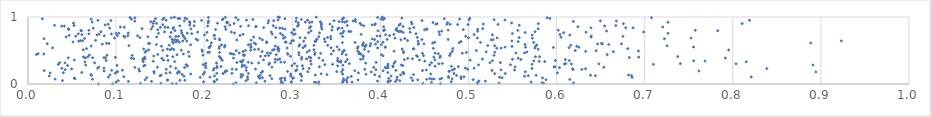
| Category | Series 0 |
|---|---|
| 0.2328687505354845 | 0.001 |
| 0.07985631081424627 | 0.002 |
| 0.32970792937901716 | 0.003 |
| 0.09586170251960835 | 0.004 |
| 0.468317660691981 | 0.005 |
| 0.16840218601111323 | 0.006 |
| 0.16377316991477586 | 0.007 |
| 0.44841327587638014 | 0.008 |
| 0.12768319481553603 | 0.009 |
| 0.5101289718172626 | 0.01 |
| 0.5851955264971506 | 0.011 |
| 0.15096220773053282 | 0.012 |
| 0.28772167522168735 | 0.013 |
| 0.5345921869728488 | 0.014 |
| 0.6191756038142968 | 0.015 |
| 0.28903604583037135 | 0.016 |
| 0.25926370127524345 | 0.017 |
| 0.583497027038752 | 0.018 |
| 0.23612617243051293 | 0.019 |
| 0.5104325848255693 | 0.02 |
| 0.45796966681437346 | 0.021 |
| 0.32661529935529565 | 0.022 |
| 0.3569881664401344 | 0.023 |
| 0.32506366698966016 | 0.024 |
| 0.4087326561707222 | 0.025 |
| 0.29890451249362826 | 0.026 |
| 0.0999517640275771 | 0.027 |
| 0.3620035093107602 | 0.028 |
| 0.5711118244665004 | 0.029 |
| 0.3678636016856771 | 0.03 |
| 0.33016795018199285 | 0.031 |
| 0.1993451033296899 | 0.032 |
| 0.29874945473208747 | 0.033 |
| 0.48039946728180183 | 0.034 |
| 0.21180971960481088 | 0.035 |
| 0.21098794096834272 | 0.036 |
| 0.4171767720957875 | 0.037 |
| 0.11392857607429108 | 0.038 |
| 0.14019868509256161 | 0.039 |
| 0.2874289543334464 | 0.04 |
| 0.4089311232788855 | 0.041 |
| 0.26893037244798557 | 0.042 |
| 0.5191626881948773 | 0.043 |
| 0.3966805963971781 | 0.044 |
| 0.3575202795973894 | 0.045 |
| 0.5117984216452389 | 0.046 |
| 0.24737268440043192 | 0.047 |
| 0.4113730152044808 | 0.048 |
| 0.42203946458177044 | 0.049 |
| 0.10242254594053013 | 0.05 |
| 0.03911909487975007 | 0.051 |
| 0.4366187233679497 | 0.052 |
| 0.31019966936869225 | 0.053 |
| 0.3582213677625674 | 0.054 |
| 0.17235700457381598 | 0.055 |
| 0.17809717594927243 | 0.056 |
| 0.29170650323487546 | 0.057 |
| 0.15858816228656591 | 0.058 |
| 0.15816459434712005 | 0.059 |
| 0.3614363946928071 | 0.06 |
| 0.3745648386261391 | 0.061 |
| 0.44241928218221815 | 0.062 |
| 0.13293241169433367 | 0.063 |
| 0.5878964906693323 | 0.064 |
| 0.5053427729518827 | 0.065 |
| 0.21448796717333118 | 0.066 |
| 0.4187717475298791 | 0.067 |
| 0.6149547701402488 | 0.068 |
| 0.4525678347234705 | 0.069 |
| 0.24937516918839986 | 0.07 |
| 0.07319056521161227 | 0.071 |
| 0.458594147436883 | 0.072 |
| 0.0307659920790454 | 0.073 |
| 0.4676146336173843 | 0.074 |
| 0.4609212214147962 | 0.075 |
| 0.48139518945270043 | 0.076 |
| 0.28627201561672666 | 0.077 |
| 0.05331611529346647 | 0.078 |
| 0.3581332978127547 | 0.079 |
| 0.2767040038696874 | 0.08 |
| 0.4916735848345679 | 0.081 |
| 0.45604758193484707 | 0.082 |
| 0.40934783081463133 | 0.083 |
| 0.4695348456406977 | 0.084 |
| 0.2878412093043303 | 0.085 |
| 0.26302418100290703 | 0.086 |
| 0.300279531940986 | 0.087 |
| 0.05244781303607693 | 0.088 |
| 0.3013600324232738 | 0.089 |
| 0.29146711114821133 | 0.09 |
| 0.4349559166169362 | 0.091 |
| 0.5840233962609025 | 0.092 |
| 0.5380355820448371 | 0.093 |
| 0.2660654545261235 | 0.094 |
| 0.13480485293380473 | 0.095 |
| 0.3629970421834168 | 0.096 |
| 0.6856957919775051 | 0.097 |
| 0.4772890403069291 | 0.098 |
| 0.19551447348626427 | 0.099 |
| 0.5353494066396696 | 0.1 |
| 0.24193530837986055 | 0.101 |
| 0.09128586747796508 | 0.102 |
| 0.20645783469628998 | 0.103 |
| 0.41893606247042336 | 0.104 |
| 0.8209304908400216 | 0.105 |
| 0.2491481330173907 | 0.106 |
| 0.49492015454373905 | 0.107 |
| 0.49148069610068434 | 0.108 |
| 0.10860939980728723 | 0.109 |
| 0.24218563662986314 | 0.11 |
| 0.4772841884413239 | 0.111 |
| 0.26144929191852617 | 0.112 |
| 0.3987702632458656 | 0.113 |
| 0.36689843125906374 | 0.114 |
| 0.5636171093701212 | 0.115 |
| 0.3106588605299738 | 0.116 |
| 0.1770847698549204 | 0.117 |
| 0.2981478704582018 | 0.118 |
| 0.024150729611461252 | 0.119 |
| 0.41212419324857896 | 0.12 |
| 0.21166065104273768 | 0.121 |
| 0.14974056795918034 | 0.122 |
| 0.5678627244585472 | 0.123 |
| 0.6440480887198466 | 0.124 |
| 0.27472221087042126 | 0.125 |
| 0.684959660125566 | 0.126 |
| 0.4864065783149276 | 0.127 |
| 0.2634008439309212 | 0.128 |
| 0.0718967995497799 | 0.129 |
| 0.5767779869952437 | 0.13 |
| 0.6385446493662993 | 0.131 |
| 0.15120932257867947 | 0.132 |
| 0.6815573095618966 | 0.133 |
| 0.32609280352704073 | 0.134 |
| 0.4229501292705765 | 0.135 |
| 0.09306859038011994 | 0.136 |
| 0.243905293665572 | 0.137 |
| 0.39356451659883596 | 0.138 |
| 0.3393518279098924 | 0.139 |
| 0.43754894708359426 | 0.14 |
| 0.07138485575765263 | 0.141 |
| 0.24210626047522532 | 0.142 |
| 0.30901662348794845 | 0.143 |
| 0.17487638439330488 | 0.144 |
| 0.198842802520676 | 0.145 |
| 0.383671814693307 | 0.146 |
| 0.35721873548367944 | 0.147 |
| 0.18472549303354702 | 0.148 |
| 0.29814473843474876 | 0.149 |
| 0.45724470795385963 | 0.15 |
| 0.30948837161336396 | 0.151 |
| 0.3327470623248263 | 0.152 |
| 0.4264730480728496 | 0.153 |
| 0.5296685749882916 | 0.154 |
| 0.22129531614713416 | 0.155 |
| 0.5416364656752849 | 0.156 |
| 0.48344974856481526 | 0.157 |
| 0.25009711345329333 | 0.158 |
| 0.21424059010582408 | 0.159 |
| 0.23143627569005054 | 0.16 |
| 0.1694611853810999 | 0.161 |
| 0.09888319057937123 | 0.162 |
| 0.15671518558429764 | 0.163 |
| 0.14311296365710147 | 0.164 |
| 0.025120592958008947 | 0.165 |
| 0.6008926748481448 | 0.166 |
| 0.37507282681856924 | 0.167 |
| 0.2648081104778591 | 0.168 |
| 0.04012231677047662 | 0.169 |
| 0.16107133733087675 | 0.17 |
| 0.40842148806568146 | 0.171 |
| 0.06103960891388671 | 0.172 |
| 0.4256873946628732 | 0.173 |
| 0.20038088850511737 | 0.174 |
| 0.42578098037090817 | 0.175 |
| 0.17196198564926146 | 0.176 |
| 0.22350257829591913 | 0.177 |
| 0.10073414729269992 | 0.178 |
| 0.8943069853897898 | 0.179 |
| 0.38956207757628114 | 0.18 |
| 0.3559401647155821 | 0.181 |
| 0.5644064006440236 | 0.182 |
| 0.3175662662653379 | 0.183 |
| 0.10172317379097051 | 0.184 |
| 0.35042003271572086 | 0.185 |
| 0.14299681292843347 | 0.186 |
| 0.2946496954638854 | 0.187 |
| 0.26632624460783694 | 0.188 |
| 0.17070290930114507 | 0.189 |
| 0.4777139435478369 | 0.19 |
| 0.4783994799006209 | 0.191 |
| 0.22398273817426495 | 0.192 |
| 0.12664823392915525 | 0.193 |
| 0.0863139867749192 | 0.194 |
| 0.7614707076780228 | 0.195 |
| 0.2255996856112812 | 0.196 |
| 0.3037541609415234 | 0.197 |
| 0.40305924648486113 | 0.198 |
| 0.3709177903242866 | 0.199 |
| 0.01841185776337817 | 0.2 |
| 0.44778681369250084 | 0.201 |
| 0.5265301150501831 | 0.202 |
| 0.24774072713833573 | 0.203 |
| 0.4176206209943413 | 0.204 |
| 0.09502699033719308 | 0.205 |
| 0.10715025703546321 | 0.206 |
| 0.21033277072568435 | 0.207 |
| 0.5522770664286352 | 0.208 |
| 0.4817292498183987 | 0.209 |
| 0.4521044349714677 | 0.21 |
| 0.5368813309387351 | 0.211 |
| 0.3053146128705728 | 0.212 |
| 0.39499648759052697 | 0.213 |
| 0.04220802862150863 | 0.214 |
| 0.6186581424963673 | 0.215 |
| 0.35738085853121215 | 0.216 |
| 0.23632425237678 | 0.217 |
| 0.6286648173595683 | 0.218 |
| 0.3823027056801488 | 0.219 |
| 0.1569500295169769 | 0.22 |
| 0.4988740404298041 | 0.221 |
| 0.2316721457045835 | 0.222 |
| 0.1257837520191003 | 0.223 |
| 0.04949625400770519 | 0.224 |
| 0.25820148214637306 | 0.225 |
| 0.48405676518307583 | 0.226 |
| 0.6182791124080771 | 0.227 |
| 0.6328302813062713 | 0.228 |
| 0.31230264443818856 | 0.229 |
| 0.8385374567968015 | 0.23 |
| 0.5720448528303362 | 0.231 |
| 0.21120558554560642 | 0.232 |
| 0.3190894370409938 | 0.233 |
| 0.03839661001681549 | 0.234 |
| 0.16774482123650103 | 0.235 |
| 0.07896081902508312 | 0.236 |
| 0.5063460903356365 | 0.237 |
| 0.08621745128475156 | 0.238 |
| 0.49636356584575037 | 0.239 |
| 0.40701854491453193 | 0.24 |
| 0.2019129035963283 | 0.241 |
| 0.4087574256944718 | 0.242 |
| 0.2143647086794327 | 0.243 |
| 0.17773127963488078 | 0.244 |
| 0.6033551965119244 | 0.245 |
| 0.4053160628417304 | 0.246 |
| 0.2478003390432315 | 0.247 |
| 0.12123343190717539 | 0.248 |
| 0.3924768235207914 | 0.249 |
| 0.6535389961754724 | 0.25 |
| 0.14691086571393241 | 0.251 |
| 0.276831329284828 | 0.252 |
| 0.08049048390907887 | 0.253 |
| 0.5970693848132125 | 0.254 |
| 0.5529061691099615 | 0.255 |
| 0.41429525402876277 | 0.256 |
| 0.3306788769487885 | 0.257 |
| 0.5982138059570751 | 0.258 |
| 0.4884262082714512 | 0.259 |
| 0.2191770282978195 | 0.26 |
| 0.24302291050637637 | 0.261 |
| 0.16177201513523043 | 0.262 |
| 0.48060230975238605 | 0.263 |
| 0.21461223447545008 | 0.264 |
| 0.4619929761594165 | 0.265 |
| 0.3055107124889106 | 0.266 |
| 0.1313550164100672 | 0.267 |
| 0.18096591132298212 | 0.268 |
| 0.4142182698608473 | 0.269 |
| 0.40854619802082226 | 0.27 |
| 0.3515308216746168 | 0.271 |
| 0.20158342161109177 | 0.272 |
| 0.3114559975238298 | 0.273 |
| 0.29961213386422747 | 0.274 |
| 0.42533375279879715 | 0.275 |
| 0.04496393452271519 | 0.276 |
| 0.24565868135688218 | 0.277 |
| 0.10113879592445729 | 0.278 |
| 0.13277377377719812 | 0.279 |
| 0.357355536694567 | 0.28 |
| 0.24333229863103412 | 0.281 |
| 0.06540808310089241 | 0.282 |
| 0.8910408556456453 | 0.283 |
| 0.4558425768731821 | 0.284 |
| 0.4238301634432555 | 0.285 |
| 0.5112785337230603 | 0.286 |
| 0.547698810485189 | 0.287 |
| 0.17948643447374857 | 0.288 |
| 0.1988192341601751 | 0.289 |
| 0.336977125428229 | 0.29 |
| 0.2734619893491457 | 0.291 |
| 0.03438634216246783 | 0.292 |
| 0.7098118697170744 | 0.293 |
| 0.3456767614437163 | 0.294 |
| 0.5721566392409666 | 0.295 |
| 0.3213937926912358 | 0.296 |
| 0.40859392018901275 | 0.297 |
| 0.6088341586629942 | 0.298 |
| 0.6168350638964422 | 0.299 |
| 0.6480261242633237 | 0.3 |
| 0.8036658700635181 | 0.301 |
| 0.4662555592006584 | 0.302 |
| 0.7404417649579672 | 0.303 |
| 0.364686581490101 | 0.304 |
| 0.6102960533056495 | 0.305 |
| 0.30257536572641985 | 0.306 |
| 0.4702284417816267 | 0.307 |
| 0.2017891765553368 | 0.308 |
| 0.4155865925804092 | 0.309 |
| 0.2740612884516259 | 0.31 |
| 0.38320426616621917 | 0.311 |
| 0.2540614689096322 | 0.312 |
| 0.21392693870172164 | 0.313 |
| 0.26176045986840235 | 0.314 |
| 0.04197299641558694 | 0.315 |
| 0.07564532919537925 | 0.316 |
| 0.5242989191587619 | 0.317 |
| 0.4579875230344952 | 0.318 |
| 0.035980581546859125 | 0.319 |
| 0.5361631411791055 | 0.32 |
| 0.23702989705355226 | 0.321 |
| 0.3951193306284928 | 0.322 |
| 0.3548040561250946 | 0.323 |
| 0.29110610044663776 | 0.324 |
| 0.25002293350822813 | 0.325 |
| 0.28033370188008555 | 0.326 |
| 0.28710764402408717 | 0.327 |
| 0.2428632333772991 | 0.328 |
| 0.2427691831951695 | 0.329 |
| 0.06467105879961565 | 0.33 |
| 0.8152276090001886 | 0.331 |
| 0.36041981021244673 | 0.332 |
| 0.13083678808927002 | 0.333 |
| 0.41685777649027567 | 0.334 |
| 0.1664867689416213 | 0.335 |
| 0.5865783860306759 | 0.336 |
| 0.24114663299241934 | 0.337 |
| 0.5802975465360085 | 0.338 |
| 0.35226961925843847 | 0.339 |
| 0.14212897004012592 | 0.34 |
| 0.45032658499363887 | 0.341 |
| 0.7684765524940267 | 0.342 |
| 0.35522843062818354 | 0.343 |
| 0.3207351611791398 | 0.344 |
| 0.5741253617801123 | 0.345 |
| 0.75559960699768 | 0.346 |
| 0.5271016621739153 | 0.347 |
| 0.35131416596717036 | 0.348 |
| 0.614413284880881 | 0.349 |
| 0.08877070215167027 | 0.35 |
| 0.5985726580354155 | 0.351 |
| 0.3346552393608435 | 0.352 |
| 0.15894526333149306 | 0.353 |
| 0.22044921145764806 | 0.354 |
| 0.15373409631381674 | 0.355 |
| 0.5019032516362569 | 0.356 |
| 0.2442486527507023 | 0.357 |
| 0.4443909698781322 | 0.358 |
| 0.0525685704185076 | 0.359 |
| 0.26729869221275604 | 0.36 |
| 0.2833889654932089 | 0.361 |
| 0.4618782922894812 | 0.362 |
| 0.13032637117799484 | 0.363 |
| 0.4272671821898012 | 0.364 |
| 0.609929409916648 | 0.365 |
| 0.5594142549465395 | 0.366 |
| 0.3624194270413471 | 0.367 |
| 0.3773861737588622 | 0.368 |
| 0.5498917908953667 | 0.369 |
| 0.31055290580765305 | 0.37 |
| 0.28067783065432694 | 0.371 |
| 0.5159071221083986 | 0.372 |
| 0.28569389503376186 | 0.373 |
| 0.31610985463199637 | 0.374 |
| 0.13287497547286475 | 0.375 |
| 0.3802266414646184 | 0.376 |
| 0.4363717968949339 | 0.377 |
| 0.11990864186166716 | 0.378 |
| 0.13081149792468727 | 0.379 |
| 0.21911892266529587 | 0.38 |
| 0.3515426062237864 | 0.381 |
| 0.43102270666480214 | 0.382 |
| 0.15190011684923244 | 0.383 |
| 0.11734461634565174 | 0.384 |
| 0.556315326515052 | 0.385 |
| 0.23323822100191383 | 0.386 |
| 0.7915612625171279 | 0.387 |
| 0.3303091844857411 | 0.388 |
| 0.06499796064777552 | 0.389 |
| 0.04570144779571794 | 0.39 |
| 0.08798237176194323 | 0.391 |
| 0.3209522473213686 | 0.392 |
| 0.0732267408865892 | 0.393 |
| 0.08627565886309096 | 0.394 |
| 0.6825300358482853 | 0.395 |
| 0.4676002399995709 | 0.396 |
| 0.09912291202665413 | 0.397 |
| 0.31070715731809695 | 0.398 |
| 0.13254798594098605 | 0.399 |
| 0.6931379522504656 | 0.4 |
| 0.21787516656294303 | 0.401 |
| 0.3189509877104869 | 0.402 |
| 0.4606350772814297 | 0.403 |
| 0.06785691480622646 | 0.404 |
| 0.06287314591645121 | 0.405 |
| 0.5760050283521341 | 0.406 |
| 0.1643776255424627 | 0.407 |
| 0.5807295719742631 | 0.408 |
| 0.7374978565481266 | 0.409 |
| 0.4421427220230836 | 0.41 |
| 0.21710507690825176 | 0.411 |
| 0.18298741502771243 | 0.412 |
| 0.2978931240547795 | 0.413 |
| 0.26394503855637497 | 0.414 |
| 0.38065176780548127 | 0.415 |
| 0.46803176439387206 | 0.416 |
| 0.38045406355955247 | 0.417 |
| 0.1427359283893932 | 0.418 |
| 0.40302317426505785 | 0.419 |
| 0.26942545614593727 | 0.42 |
| 0.1579722638351404 | 0.421 |
| 0.44108569092166194 | 0.422 |
| 0.4489053771437226 | 0.423 |
| 0.47850915710132647 | 0.424 |
| 0.24524523829110667 | 0.425 |
| 0.27314466686855543 | 0.426 |
| 0.11827873968942282 | 0.427 |
| 0.5289762655049757 | 0.428 |
| 0.08975361054274134 | 0.429 |
| 0.2457089299220112 | 0.43 |
| 0.19855393270759902 | 0.431 |
| 0.06966929101943653 | 0.432 |
| 0.30757814854016763 | 0.433 |
| 0.2444978061404588 | 0.434 |
| 0.3610561642008163 | 0.435 |
| 0.16916095646283558 | 0.436 |
| 0.2818363614510072 | 0.437 |
| 0.40123490271467877 | 0.438 |
| 0.6573883551539146 | 0.439 |
| 0.009542069185878077 | 0.44 |
| 0.1471951246333586 | 0.441 |
| 0.3254662284951937 | 0.442 |
| 0.37801061309249107 | 0.443 |
| 0.23374641133592733 | 0.444 |
| 0.29498129927742944 | 0.445 |
| 0.34411281900558277 | 0.446 |
| 0.017848712684382484 | 0.447 |
| 0.1763483515642238 | 0.448 |
| 0.3563905372124083 | 0.449 |
| 0.2314262287391219 | 0.45 |
| 0.37552287037723764 | 0.451 |
| 0.011416452305699987 | 0.452 |
| 0.46571386789806735 | 0.453 |
| 0.47957449613720926 | 0.454 |
| 0.29453697583879646 | 0.455 |
| 0.2295355535509207 | 0.456 |
| 0.33219382224437244 | 0.457 |
| 0.4477058415832822 | 0.458 |
| 0.49287973091167603 | 0.459 |
| 0.4620965998084787 | 0.46 |
| 0.2397609375016636 | 0.461 |
| 0.27526651639721733 | 0.462 |
| 0.5537677510810197 | 0.463 |
| 0.5636329153925091 | 0.464 |
| 0.271669754137733 | 0.465 |
| 0.4263393626720744 | 0.466 |
| 0.32566993241619935 | 0.467 |
| 0.37602600381678053 | 0.468 |
| 0.30733273592783183 | 0.469 |
| 0.217501929232099 | 0.47 |
| 0.4976239040679441 | 0.471 |
| 0.2041515379885398 | 0.472 |
| 0.13293418151784475 | 0.473 |
| 0.529888527935144 | 0.474 |
| 0.20596265589495966 | 0.475 |
| 0.3167607474205473 | 0.476 |
| 0.182124506529741 | 0.477 |
| 0.5663672369735869 | 0.478 |
| 0.3575017229996845 | 0.479 |
| 0.5200309011668669 | 0.48 |
| 0.4263028555602272 | 0.481 |
| 0.3575224913804248 | 0.482 |
| 0.6644271922599875 | 0.483 |
| 0.2657213959227084 | 0.484 |
| 0.24406381033987867 | 0.485 |
| 0.3864927405034877 | 0.486 |
| 0.6329836548542455 | 0.487 |
| 0.48156892232085435 | 0.488 |
| 0.1978483973466606 | 0.489 |
| 0.4154806097930981 | 0.49 |
| 0.2845351414986588 | 0.491 |
| 0.374360664325158 | 0.492 |
| 0.6929255565586829 | 0.493 |
| 0.1342716954455231 | 0.494 |
| 0.34679618017419056 | 0.495 |
| 0.23644150048174173 | 0.496 |
| 0.6448827170085337 | 0.497 |
| 0.3193204674074658 | 0.498 |
| 0.5089090461861537 | 0.499 |
| 0.6212405624341767 | 0.5 |
| 0.246800875498553 | 0.501 |
| 0.3589057278210407 | 0.502 |
| 0.1529748336385407 | 0.503 |
| 0.25273453661713563 | 0.504 |
| 0.17393748941389953 | 0.505 |
| 0.2776062888108509 | 0.506 |
| 0.795307407245385 | 0.507 |
| 0.1974631419130265 | 0.508 |
| 0.13698660290029774 | 0.509 |
| 0.06274452310956435 | 0.51 |
| 0.1611413371021453 | 0.511 |
| 0.3245606357483525 | 0.512 |
| 0.3531430944742566 | 0.513 |
| 0.2794534023107528 | 0.514 |
| 0.16532734231340485 | 0.515 |
| 0.25716422534645245 | 0.516 |
| 0.38188409324747796 | 0.517 |
| 0.5790921931091497 | 0.518 |
| 0.2616315464423655 | 0.519 |
| 0.4247644404286385 | 0.52 |
| 0.28337227580449853 | 0.521 |
| 0.15815620624006443 | 0.522 |
| 0.1312424917776207 | 0.523 |
| 0.43729473699469734 | 0.524 |
| 0.2848552676554216 | 0.525 |
| 0.43790937594965285 | 0.526 |
| 0.6807587112350154 | 0.527 |
| 0.0664174211276809 | 0.528 |
| 0.1631146905805304 | 0.529 |
| 0.4821677258881806 | 0.53 |
| 0.21692649492924465 | 0.531 |
| 0.4600758459085371 | 0.532 |
| 0.5320613437607339 | 0.533 |
| 0.5369511986389948 | 0.534 |
| 0.37396172389850124 | 0.535 |
| 0.5753676701287677 | 0.536 |
| 0.29415750300445354 | 0.537 |
| 0.39683151270161865 | 0.538 |
| 0.027831864720353927 | 0.539 |
| 0.3120710027967416 | 0.54 |
| 0.343980160959254 | 0.541 |
| 0.20577241457217066 | 0.542 |
| 0.6141903274124487 | 0.543 |
| 0.5963973410188016 | 0.544 |
| 0.2529950652450945 | 0.545 |
| 0.20553575764347665 | 0.546 |
| 0.4056558295719017 | 0.547 |
| 0.6253638415625689 | 0.548 |
| 0.5648065806326037 | 0.549 |
| 0.5414860606743422 | 0.55 |
| 0.28360775538185645 | 0.551 |
| 0.7554174416639647 | 0.552 |
| 0.4054929387695432 | 0.553 |
| 0.22304059818132393 | 0.554 |
| 0.3508992764756632 | 0.555 |
| 0.3747126855063434 | 0.556 |
| 0.25325474337748166 | 0.557 |
| 0.217272369735097 | 0.558 |
| 0.38287301030488674 | 0.559 |
| 0.5759972122870259 | 0.56 |
| 0.5493606961732844 | 0.561 |
| 0.3141466625073436 | 0.562 |
| 0.1515267759775687 | 0.563 |
| 0.6228814490105092 | 0.564 |
| 0.30749676683616656 | 0.565 |
| 0.0716804846847664 | 0.566 |
| 0.2806096124695656 | 0.567 |
| 0.3883038236448956 | 0.568 |
| 0.20723348216400905 | 0.569 |
| 0.5297124634546634 | 0.57 |
| 0.7254470320021977 | 0.571 |
| 0.1145871683461871 | 0.572 |
| 0.3148055430134502 | 0.573 |
| 0.5218747791134455 | 0.574 |
| 0.38045909414636436 | 0.575 |
| 0.22361778082747108 | 0.576 |
| 0.34020004221044897 | 0.577 |
| 0.3245696310630166 | 0.578 |
| 0.1603430564193915 | 0.579 |
| 0.6161033628737431 | 0.58 |
| 0.5774511410276545 | 0.581 |
| 0.3797281091854645 | 0.582 |
| 0.38373994904566033 | 0.583 |
| 0.25005313439681 | 0.584 |
| 0.1845516890070672 | 0.585 |
| 0.21969685334169353 | 0.586 |
| 0.30842285981044526 | 0.587 |
| 0.4012806254844573 | 0.588 |
| 0.14571847374590474 | 0.589 |
| 0.6590737294932422 | 0.59 |
| 0.5641541076503771 | 0.591 |
| 0.2526462548617163 | 0.592 |
| 0.44284467116649784 | 0.593 |
| 0.3946012910557051 | 0.594 |
| 0.0844289266843109 | 0.595 |
| 0.2585054633436774 | 0.596 |
| 0.449428932411021 | 0.597 |
| 0.6519622899446983 | 0.598 |
| 0.6464325645034055 | 0.599 |
| 0.6735950186446555 | 0.6 |
| 0.021846514826167618 | 0.601 |
| 0.38890134141713106 | 0.602 |
| 0.4434049644218704 | 0.603 |
| 0.13809201090957857 | 0.604 |
| 0.09202530717089308 | 0.605 |
| 0.6509126648930414 | 0.606 |
| 0.13675730379552653 | 0.607 |
| 0.08913594375012146 | 0.608 |
| 0.2979160963841372 | 0.609 |
| 0.1647191971874873 | 0.61 |
| 0.4593224540834562 | 0.611 |
| 0.25677324334000806 | 0.612 |
| 0.8884169369760289 | 0.613 |
| 0.20807523486954715 | 0.614 |
| 0.38071180719422215 | 0.615 |
| 0.48951483772842885 | 0.616 |
| 0.2709963569809485 | 0.617 |
| 0.3568108575007407 | 0.618 |
| 0.3712280748424617 | 0.619 |
| 0.573992410887173 | 0.62 |
| 0.5136312323311861 | 0.621 |
| 0.171715241749954 | 0.622 |
| 0.4616348478038499 | 0.623 |
| 0.2929864087749474 | 0.624 |
| 0.4030047687841004 | 0.625 |
| 0.1647651403709839 | 0.626 |
| 0.2920281063847251 | 0.627 |
| 0.05108593264180061 | 0.628 |
| 0.16796600271446127 | 0.629 |
| 0.27083917025235005 | 0.63 |
| 0.33720541677337423 | 0.631 |
| 0.39700037963658874 | 0.632 |
| 0.5563843308018567 | 0.633 |
| 0.49145746300209714 | 0.634 |
| 0.16411236771616422 | 0.635 |
| 0.3267468481973008 | 0.636 |
| 0.32569566877834377 | 0.637 |
| 0.4427792217932621 | 0.638 |
| 0.31291496419252174 | 0.639 |
| 0.05750754682820047 | 0.64 |
| 0.1802833623912884 | 0.641 |
| 0.5492336195077684 | 0.642 |
| 0.17567629815606156 | 0.643 |
| 0.923124045688034 | 0.644 |
| 0.2994867901061211 | 0.645 |
| 0.061977117232798196 | 0.646 |
| 0.059542780491547154 | 0.647 |
| 0.30139666770416074 | 0.648 |
| 0.43089418666213664 | 0.649 |
| 0.16931023512723564 | 0.65 |
| 0.20333637485432832 | 0.651 |
| 0.07665176036685784 | 0.652 |
| 0.1696976161606396 | 0.653 |
| 0.25327329505511387 | 0.654 |
| 0.19248383891512688 | 0.655 |
| 0.21760078317642284 | 0.656 |
| 0.23699702036494263 | 0.657 |
| 0.5256746769401209 | 0.658 |
| 0.26602535246053827 | 0.659 |
| 0.4232707751050513 | 0.66 |
| 0.5279427704313181 | 0.661 |
| 0.16661420145176586 | 0.662 |
| 0.44717488023102236 | 0.663 |
| 0.39345370164358473 | 0.664 |
| 0.47688048513173886 | 0.665 |
| 0.407644902654274 | 0.666 |
| 0.32764697071844495 | 0.667 |
| 0.32799626441983276 | 0.668 |
| 0.16352944269659675 | 0.669 |
| 0.19073200766134157 | 0.67 |
| 0.2173422859817835 | 0.671 |
| 0.3906619248719916 | 0.672 |
| 0.33643771662068955 | 0.673 |
| 0.34378579231677764 | 0.674 |
| 0.21215710933413545 | 0.675 |
| 0.7223425839786884 | 0.676 |
| 0.01813915785168263 | 0.677 |
| 0.17833763102926292 | 0.678 |
| 0.4277233520715076 | 0.679 |
| 0.06425540738111979 | 0.68 |
| 0.2899307199146953 | 0.681 |
| 0.2631030583940389 | 0.682 |
| 0.5724554525395982 | 0.683 |
| 0.41652606085802557 | 0.684 |
| 0.0982008120267831 | 0.685 |
| 0.7525659870829869 | 0.686 |
| 0.510104397531556 | 0.687 |
| 0.5324264636776995 | 0.688 |
| 0.3147044384966454 | 0.689 |
| 0.4999149408514587 | 0.69 |
| 0.30868616859897957 | 0.691 |
| 0.5574677706806241 | 0.692 |
| 0.12700282531501683 | 0.693 |
| 0.34005317122080025 | 0.694 |
| 0.28099985441931385 | 0.695 |
| 0.4418389190786892 | 0.696 |
| 0.2915418208477507 | 0.697 |
| 0.6050138434503893 | 0.698 |
| 0.11001999061925971 | 0.699 |
| 0.6391439145470202 | 0.7 |
| 0.2561844956299921 | 0.701 |
| 0.043213402005281565 | 0.702 |
| 0.1460945972275438 | 0.703 |
| 0.13606666833943704 | 0.704 |
| 0.17682333038009768 | 0.705 |
| 0.1613237707366142 | 0.706 |
| 0.33008980624347684 | 0.707 |
| 0.3436493119899431 | 0.708 |
| 0.3570439583354996 | 0.709 |
| 0.16791876068249623 | 0.71 |
| 0.6752623083098611 | 0.711 |
| 0.1708907295553851 | 0.712 |
| 0.49683336973548786 | 0.713 |
| 0.05422552098207256 | 0.714 |
| 0.10889344259702793 | 0.715 |
| 0.6392686172622388 | 0.716 |
| 0.3997715110141723 | 0.717 |
| 0.3961833002814712 | 0.718 |
| 0.08647328098512841 | 0.719 |
| 0.11328925553990876 | 0.72 |
| 0.12430266187659678 | 0.721 |
| 0.1014394880247953 | 0.722 |
| 0.41048868890917356 | 0.723 |
| 0.24061469454935125 | 0.724 |
| 0.21154944148034294 | 0.725 |
| 0.046745149768191996 | 0.726 |
| 0.21131873849329852 | 0.727 |
| 0.17584969964306718 | 0.728 |
| 0.2891657185781119 | 0.729 |
| 0.6150104978337653 | 0.73 |
| 0.5722788229355679 | 0.731 |
| 0.078349949950415 | 0.732 |
| 0.20037895632012015 | 0.733 |
| 0.527186823326456 | 0.734 |
| 0.4058949561315921 | 0.735 |
| 0.061169936654198676 | 0.736 |
| 0.5063548087047818 | 0.737 |
| 0.46713622600941773 | 0.738 |
| 0.6038457751895774 | 0.739 |
| 0.4152771390318424 | 0.74 |
| 0.3781012968580849 | 0.741 |
| 0.30136451458643043 | 0.742 |
| 0.24406706798143385 | 0.743 |
| 0.08074484083956723 | 0.744 |
| 0.30330798327707764 | 0.745 |
| 0.2771899118107408 | 0.746 |
| 0.09461191762039445 | 0.747 |
| 0.06913808397152066 | 0.748 |
| 0.05708785461889132 | 0.749 |
| 0.4403471928111071 | 0.75 |
| 0.3548642758125986 | 0.751 |
| 0.1858310934411761 | 0.752 |
| 0.5497554556518477 | 0.753 |
| 0.286634755840354 | 0.754 |
| 0.09995891703763926 | 0.755 |
| 0.14813167331006993 | 0.756 |
| 0.7263854822590998 | 0.757 |
| 0.1808055584591889 | 0.758 |
| 0.10307225364119255 | 0.759 |
| 0.1138545012610126 | 0.76 |
| 0.1745299182067228 | 0.761 |
| 0.2342745907226641 | 0.762 |
| 0.3572346221622599 | 0.763 |
| 0.33089440251740676 | 0.764 |
| 0.31845558738317903 | 0.765 |
| 0.6079143137102531 | 0.766 |
| 0.2992647949583618 | 0.767 |
| 0.5642548233375908 | 0.768 |
| 0.1624430412309944 | 0.769 |
| 0.4258414520894236 | 0.77 |
| 0.2031175351233946 | 0.771 |
| 0.4337552214523639 | 0.772 |
| 0.6333854473828262 | 0.773 |
| 0.19257324705058276 | 0.774 |
| 0.2307842254312904 | 0.775 |
| 0.6987034422625052 | 0.776 |
| 0.27605782356413266 | 0.777 |
| 0.15494124737940396 | 0.778 |
| 0.4664154082461639 | 0.779 |
| 0.08280078227136711 | 0.78 |
| 0.5755090788095152 | 0.781 |
| 0.42091329203056616 | 0.782 |
| 0.36643402618046694 | 0.783 |
| 0.36405930596415026 | 0.784 |
| 0.4223468945530672 | 0.785 |
| 0.3583180777342869 | 0.786 |
| 0.5103449360935138 | 0.787 |
| 0.423543088529864 | 0.788 |
| 0.46951558384156444 | 0.789 |
| 0.6567011721982221 | 0.79 |
| 0.3212037456428428 | 0.791 |
| 0.41925181598554406 | 0.792 |
| 0.3971842582434396 | 0.793 |
| 0.060722378188457604 | 0.794 |
| 0.782865989987258 | 0.795 |
| 0.17401758736945594 | 0.796 |
| 0.16675106862403888 | 0.797 |
| 0.05987415455482892 | 0.798 |
| 0.4035957747447788 | 0.799 |
| 0.5559728143937875 | 0.8 |
| 0.7573988253205546 | 0.801 |
| 0.06910795365789468 | 0.802 |
| 0.6019025631633005 | 0.803 |
| 0.34494798822554873 | 0.804 |
| 0.4769170407598583 | 0.805 |
| 0.3022253660070069 | 0.806 |
| 0.40471782549185564 | 0.807 |
| 0.417516815513177 | 0.808 |
| 0.45014860855051 | 0.809 |
| 0.14735277381386203 | 0.81 |
| 0.3017952518127146 | 0.811 |
| 0.4940927894747488 | 0.812 |
| 0.21290911946103996 | 0.813 |
| 0.04619310639130625 | 0.814 |
| 0.22452967471816387 | 0.815 |
| 0.4528805411726369 | 0.816 |
| 0.5103730737588018 | 0.817 |
| 0.3515593229405152 | 0.818 |
| 0.3336725932942376 | 0.819 |
| 0.29163147032528414 | 0.82 |
| 0.13993062997148142 | 0.821 |
| 0.1849227726481404 | 0.822 |
| 0.4525047639290207 | 0.823 |
| 0.5790427731853506 | 0.824 |
| 0.046052997981573474 | 0.825 |
| 0.516135628691121 | 0.826 |
| 0.12945171251987397 | 0.827 |
| 0.4332140257098991 | 0.828 |
| 0.1645521119804998 | 0.829 |
| 0.28879857958239163 | 0.83 |
| 0.41856205097136034 | 0.831 |
| 0.07414956736442202 | 0.832 |
| 0.3565382196165475 | 0.833 |
| 0.0926489300533293 | 0.834 |
| 0.28575430388582446 | 0.835 |
| 0.3194153753470942 | 0.836 |
| 0.35283501014949725 | 0.837 |
| 0.6390164753337353 | 0.838 |
| 0.6867653959280983 | 0.839 |
| 0.6784652105567229 | 0.84 |
| 0.28132005975404384 | 0.841 |
| 0.2674930438477784 | 0.842 |
| 0.4378441155849141 | 0.843 |
| 0.16531616500192647 | 0.844 |
| 0.158912410940948 | 0.845 |
| 0.15025603282480127 | 0.846 |
| 0.15550164427123814 | 0.847 |
| 0.10931655274586438 | 0.848 |
| 0.3329904424585297 | 0.849 |
| 0.10486792223968389 | 0.85 |
| 0.7203995310561069 | 0.851 |
| 0.25864528966218336 | 0.852 |
| 0.34555922989362975 | 0.853 |
| 0.40370690928533004 | 0.854 |
| 0.22377644099352312 | 0.855 |
| 0.6241620680048056 | 0.856 |
| 0.32078251322785434 | 0.857 |
| 0.42568901633556966 | 0.858 |
| 0.14160966207983694 | 0.859 |
| 0.24135519017142382 | 0.86 |
| 0.305835713298078 | 0.861 |
| 0.25887970146144856 | 0.862 |
| 0.03818426379116602 | 0.863 |
| 0.041270758141342845 | 0.864 |
| 0.20390321979811865 | 0.865 |
| 0.6544973132100198 | 0.866 |
| 0.17241077455244302 | 0.867 |
| 0.38114022020860705 | 0.868 |
| 0.18852206906732993 | 0.869 |
| 0.2503231237369373 | 0.87 |
| 0.2783393370497387 | 0.871 |
| 0.6671852685774085 | 0.872 |
| 0.05226749241112594 | 0.873 |
| 0.3625036908557554 | 0.874 |
| 0.030101999661916512 | 0.875 |
| 0.5575519530679358 | 0.876 |
| 0.42109279368676633 | 0.877 |
| 0.18350194535310427 | 0.878 |
| 0.22901514201459228 | 0.879 |
| 0.30691075775120036 | 0.88 |
| 0.3329709721244323 | 0.881 |
| 0.08760647735652216 | 0.882 |
| 0.3905155024752751 | 0.883 |
| 0.37816573647272245 | 0.884 |
| 0.15303445138095528 | 0.885 |
| 0.39365254303468245 | 0.886 |
| 0.49948903709801684 | 0.887 |
| 0.48774243491105684 | 0.888 |
| 0.5334456766276502 | 0.889 |
| 0.47920335704193795 | 0.89 |
| 0.0910130529527774 | 0.891 |
| 0.47538638272322276 | 0.892 |
| 0.4629782018783687 | 0.893 |
| 0.3428273946873929 | 0.894 |
| 0.5168118542178443 | 0.895 |
| 0.42274630237662847 | 0.896 |
| 0.4358240125162697 | 0.897 |
| 0.39423189395427405 | 0.898 |
| 0.4643988535091971 | 0.899 |
| 0.6758268327201795 | 0.9 |
| 0.579303142605048 | 0.901 |
| 0.810607120464595 | 0.902 |
| 0.23395379583256581 | 0.903 |
| 0.14593990077591845 | 0.904 |
| 0.14212797062666305 | 0.905 |
| 0.21507749618000416 | 0.906 |
| 0.3768203332281038 | 0.907 |
| 0.3329235975984697 | 0.908 |
| 0.0516871872062894 | 0.909 |
| 0.272511246644325 | 0.91 |
| 0.5489235637947327 | 0.911 |
| 0.2257030499751168 | 0.912 |
| 0.2044160056292903 | 0.913 |
| 0.30667623988392245 | 0.914 |
| 0.18391058965682172 | 0.915 |
| 0.4763683847250353 | 0.916 |
| 0.319595518745487 | 0.917 |
| 0.45964385369668637 | 0.918 |
| 0.22679205620371168 | 0.919 |
| 0.2256625798810088 | 0.92 |
| 0.7263440645193461 | 0.921 |
| 0.35963835038555103 | 0.922 |
| 0.07286039548512568 | 0.923 |
| 0.4351522850422369 | 0.924 |
| 0.3224199827140237 | 0.925 |
| 0.31488107244486396 | 0.926 |
| 0.3317555363353706 | 0.927 |
| 0.1832452917067683 | 0.928 |
| 0.1392862777609699 | 0.929 |
| 0.35687335574670664 | 0.93 |
| 0.353230168294971 | 0.931 |
| 0.37184335541782276 | 0.932 |
| 0.18878010232085607 | 0.933 |
| 0.618988395926208 | 0.934 |
| 0.30408372915797377 | 0.935 |
| 0.3619584891710885 | 0.936 |
| 0.14303544528125522 | 0.937 |
| 0.12127029270815137 | 0.938 |
| 0.667790503487069 | 0.939 |
| 0.20482888294023505 | 0.94 |
| 0.3690146810103816 | 0.941 |
| 0.17736202046391814 | 0.942 |
| 0.6496311827871367 | 0.943 |
| 0.347290462793184 | 0.944 |
| 0.2788606650357349 | 0.945 |
| 0.2730627360173927 | 0.946 |
| 0.4472887823139604 | 0.947 |
| 0.09402608393056944 | 0.948 |
| 0.1970227791006055 | 0.949 |
| 0.07945502317171549 | 0.95 |
| 0.8190199684334492 | 0.951 |
| 0.15677343192358595 | 0.952 |
| 0.24799211987816616 | 0.953 |
| 0.3174435754695134 | 0.954 |
| 0.5414014822840797 | 0.955 |
| 0.2837994042923704 | 0.956 |
| 0.5005856642307754 | 0.957 |
| 0.2384768805975388 | 0.958 |
| 0.5290480738411033 | 0.959 |
| 0.22057298508083 | 0.96 |
| 0.4031745212704577 | 0.961 |
| 0.1526402752068784 | 0.962 |
| 0.31027389139093753 | 0.963 |
| 0.37156892223731885 | 0.964 |
| 0.2552360155012299 | 0.965 |
| 0.11751082586326655 | 0.966 |
| 0.3567478028741523 | 0.967 |
| 0.07174947575625346 | 0.968 |
| 0.4006715350096852 | 0.969 |
| 0.4899781951580844 | 0.97 |
| 0.2214149818264627 | 0.971 |
| 0.1804513085452638 | 0.972 |
| 0.016350264003112902 | 0.973 |
| 0.2916476561783028 | 0.974 |
| 0.47256654562073175 | 0.975 |
| 0.1447564019705745 | 0.976 |
| 0.17230684487638415 | 0.977 |
| 0.5923475799155858 | 0.978 |
| 0.17028391778267737 | 0.979 |
| 0.4045344938927311 | 0.98 |
| 0.30461668184948576 | 0.981 |
| 0.501475532280755 | 0.982 |
| 0.1544374048247411 | 0.983 |
| 0.42436591622668884 | 0.984 |
| 0.1782447912539541 | 0.985 |
| 0.35815692575512625 | 0.986 |
| 0.16267961557836375 | 0.987 |
| 0.12133202034591484 | 0.988 |
| 0.5892775618467246 | 0.989 |
| 0.7077265026777605 | 0.99 |
| 0.2358706070821125 | 0.991 |
| 0.11580767335286879 | 0.992 |
| 0.20480688203728903 | 0.993 |
| 0.39684010753801846 | 0.994 |
| 0.2240387170353907 | 0.995 |
| 0.28536298926974 | 0.996 |
| 0.16620405660559845 | 0.997 |
| 0.32722290224249606 | 0.998 |
| 0.40226296348644286 | 0.999 |
| 0.28393670662728876 | 1 |